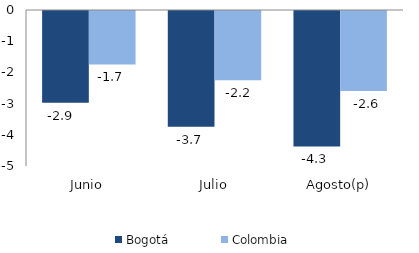
| Category | Bogotá | Colombia |
|---|---|---|
| Junio | -2.938 | -1.714 |
| Julio | -3.709 | -2.219 |
| Agosto(p) | -4.342 | -2.567 |